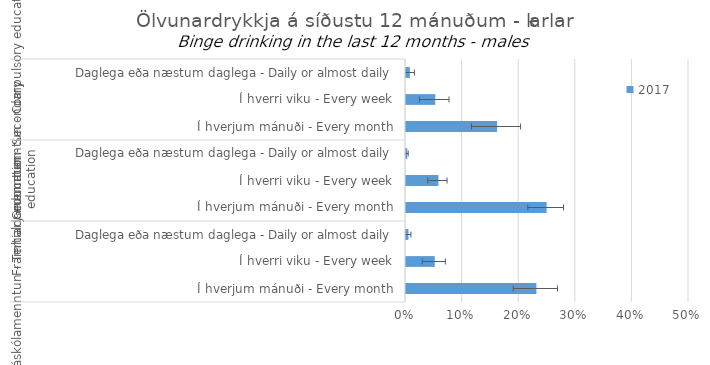
| Category | 2017 |
|---|---|
| 0 | 0.007 |
| 1 | 0.052 |
| 2 | 0.161 |
| 3 | 0.002 |
| 4 | 0.057 |
| 5 | 0.248 |
| 6 | 0.004 |
| 7 | 0.051 |
| 8 | 0.23 |